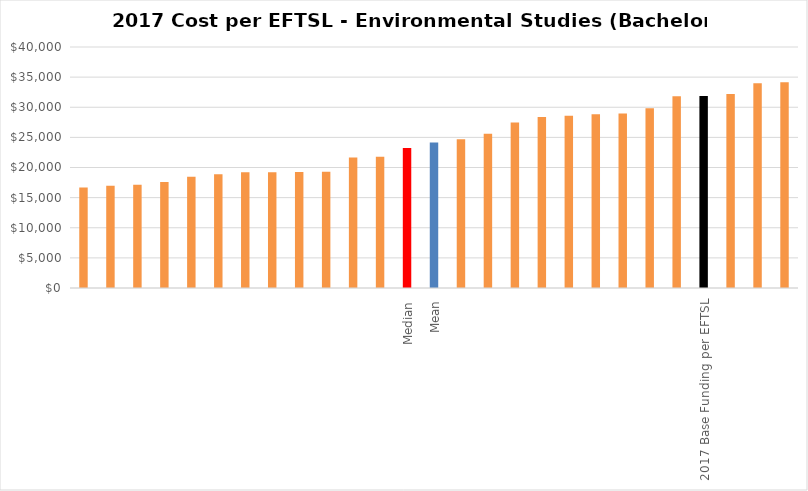
| Category | Series 0 |
|---|---|
|  | 16668.526 |
|  | 16976.058 |
|  | 17136.965 |
|  | 17582.684 |
|  | 18460.368 |
|  | 18867.632 |
|  | 19220.136 |
|  | 19229.797 |
|  | 19254.4 |
|  | 19294.331 |
|  | 21643.079 |
|  | 21796.594 |
| Median | 23251.831 |
| Mean | 24158 |
|  | 24707.068 |
|  | 25605.789 |
|  | 27451.789 |
|  | 28375.895 |
|  | 28601.733 |
|  | 28852.514 |
|  | 28975.227 |
|  | 29829.436 |
|  | 31829.97 |
| 2017 Base Funding per EFTSL | 31859 |